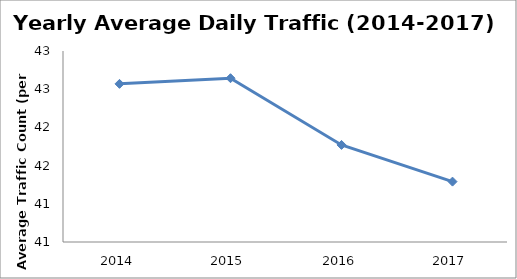
| Category | Series 0 |
|---|---|
| 2014.0 | 42.57 |
| 2015.0 | 42.644 |
| 2016.0 | 41.77 |
| 2017.0 | 41.29 |